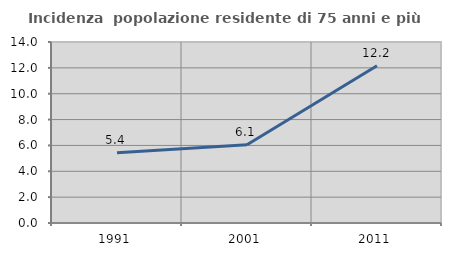
| Category | Incidenza  popolazione residente di 75 anni e più |
|---|---|
| 1991.0 | 5.425 |
| 2001.0 | 6.051 |
| 2011.0 | 12.162 |